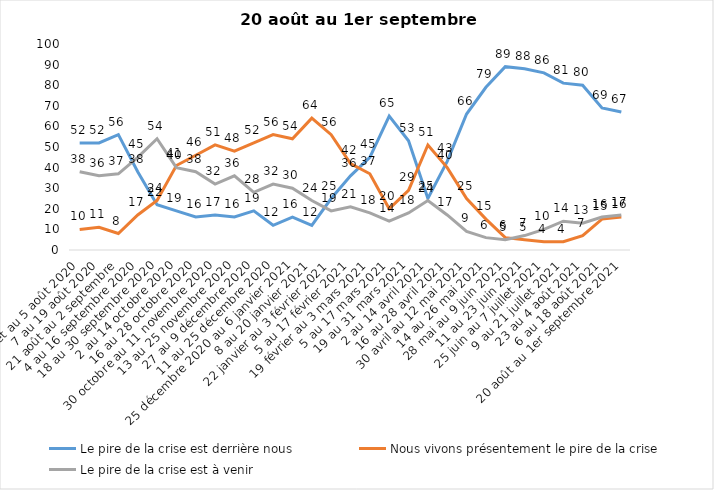
| Category | Le pire de la crise est derrière nous | Nous vivons présentement le pire de la crise | Le pire de la crise est à venir |
|---|---|---|---|
| 24 juillet au 5 août 2020 | 52 | 10 | 38 |
| 7 au 19 août 2020 | 52 | 11 | 36 |
| 21 août au 2 septembre | 56 | 8 | 37 |
| 4 au 16 septembre 2020 | 38 | 17 | 45 |
| 18 au 30 septembre 2020 | 22 | 24 | 54 |
| 2 au 14 octobre 2020 | 19 | 41 | 40 |
| 16 au 28 octobre 2020 | 16 | 46 | 38 |
| 30 octobre au 11 novembre 2020 | 17 | 51 | 32 |
| 13 au 25 novembre 2020 | 16 | 48 | 36 |
| 27 au 9 décembre 2020 | 19 | 52 | 28 |
| 11 au 25 décembre 2020 | 12 | 56 | 32 |
| 25 décembre 2020 au 6 janvier 2021 | 16 | 54 | 30 |
| 8 au 20 janvier 2021 | 12 | 64 | 24 |
| 22 janvier au 3 février 2021 | 25 | 56 | 19 |
| 5 au 17 février 2021 | 36 | 42 | 21 |
| 19 février au 3 mars 2021 | 45 | 37 | 18 |
| 5 au 17 mars 2021 | 65 | 20 | 14 |
| 19 au 31 mars 2021 | 53 | 29 | 18 |
| 2 au 14 avril 2021 | 25 | 51 | 24 |
| 16 au 28 avril 2021 | 43 | 40 | 17 |
| 30 avril au 12 mai 2021 | 66 | 25 | 9 |
| 14 au 26 mai 2021 | 79 | 15 | 6 |
| 28 mai au 9 juin 2021 | 89 | 6 | 5 |
| 11 au 23 juin 2021 | 88 | 5 | 7 |
| 25 juin au 7 juillet 2021 | 86 | 4 | 10 |
| 9 au 21 juillet 2021 | 81 | 4 | 14 |
| 23 au 4 août 2021 | 80 | 7 | 13 |
| 6 au 18 août 2021 | 69 | 15 | 16 |
| 20 août au 1er septembre 2021 | 67 | 16 | 17 |